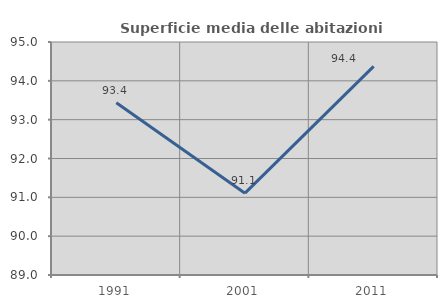
| Category | Superficie media delle abitazioni occupate |
|---|---|
| 1991.0 | 93.434 |
| 2001.0 | 91.108 |
| 2011.0 | 94.371 |